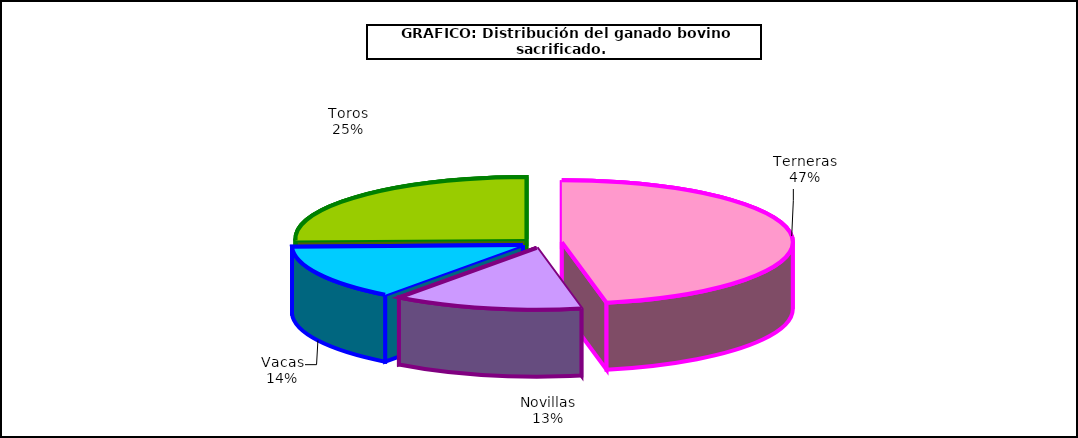
| Category | Series 0 |
|---|---|
| Terneras | 1023638 |
| Novillas | 289637 |
| Vacas | 314523 |
| Toros | 554792 |